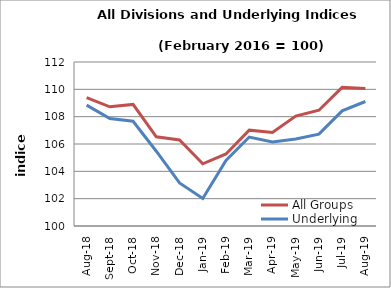
| Category | All Groups | Underlying |
|---|---|---|
| 2018-08-01 | 109.392 | 108.845 |
| 2018-09-01 | 108.722 | 107.857 |
| 2018-10-01 | 108.895 | 107.664 |
| 2018-11-01 | 106.524 | 105.471 |
| 2018-12-01 | 106.292 | 103.148 |
| 2019-01-01 | 104.55 | 102.019 |
| 2019-02-01 | 105.272 | 104.794 |
| 2019-03-01 | 107.012 | 106.51 |
| 2019-04-01 | 106.842 | 106.143 |
| 2019-05-01 | 108.044 | 106.37 |
| 2019-06-01 | 108.473 | 106.721 |
| 2019-07-01 | 110.146 | 108.423 |
| 2019-08-01 | 110.057 | 109.11 |